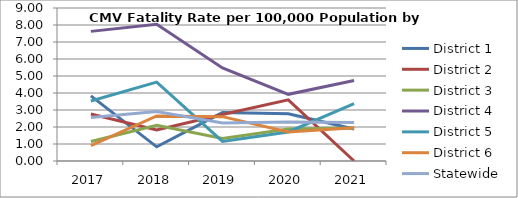
| Category | District 1 | District 2 | District 3 | District 4 | District 5 | District 6 | Statewide |
|---|---|---|---|---|---|---|---|
| 2017.0 | 3.832 | 2.764 | 1.147 | 7.625 | 3.533 | 0.9 | 2.563 |
| 2018.0 | 0.833 | 1.824 | 2.107 | 8.037 | 4.639 | 2.654 | 2.907 |
| 2019.0 | 2.847 | 2.733 | 1.331 | 5.472 | 1.15 | 2.61 | 2.238 |
| 2020.0 | 2.773 | 3.601 | 1.884 | 3.921 | 1.708 | 1.705 | 2.299 |
| 2021.0 | 1.884 | 0 | 1.936 | 4.74 | 3.37 | 1.954 | 2.262 |